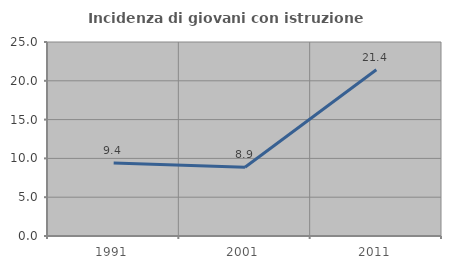
| Category | Incidenza di giovani con istruzione universitaria |
|---|---|
| 1991.0 | 9.42 |
| 2001.0 | 8.861 |
| 2011.0 | 21.429 |